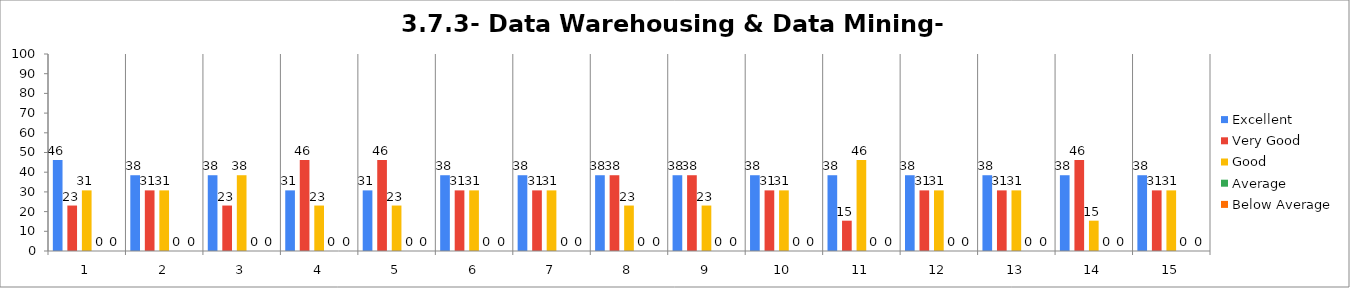
| Category | Excellent | Very Good | Good | Average | Below Average |
|---|---|---|---|---|---|
| 0 | 46.154 | 23.077 | 30.769 | 0 | 0 |
| 1 | 38.462 | 30.769 | 30.769 | 0 | 0 |
| 2 | 38.462 | 23.077 | 38.462 | 0 | 0 |
| 3 | 30.769 | 46.154 | 23.077 | 0 | 0 |
| 4 | 30.769 | 46.154 | 23.077 | 0 | 0 |
| 5 | 38.462 | 30.769 | 30.769 | 0 | 0 |
| 6 | 38.462 | 30.769 | 30.769 | 0 | 0 |
| 7 | 38.462 | 38.462 | 23.077 | 0 | 0 |
| 8 | 38.462 | 38.462 | 23.077 | 0 | 0 |
| 9 | 38.462 | 30.769 | 30.769 | 0 | 0 |
| 10 | 38.462 | 15.385 | 46.154 | 0 | 0 |
| 11 | 38.462 | 30.769 | 30.769 | 0 | 0 |
| 12 | 38.462 | 30.769 | 30.769 | 0 | 0 |
| 13 | 38.462 | 46.154 | 15.385 | 0 | 0 |
| 14 | 38.462 | 30.769 | 30.769 | 0 | 0 |